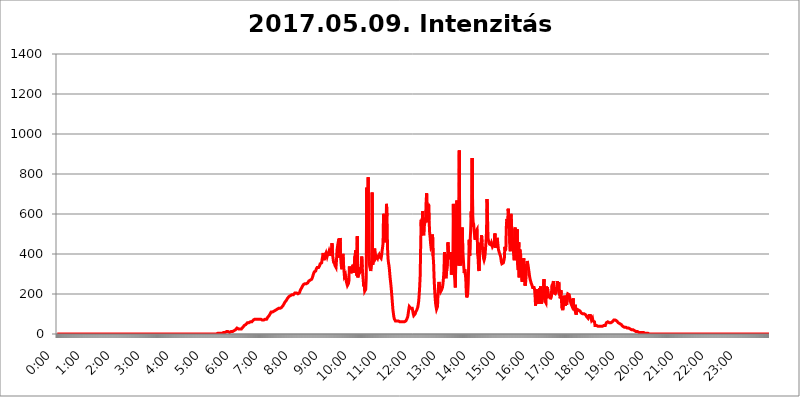
| Category | 2017.05.09. Intenzitás [W/m^2] |
|---|---|
| 0.0 | 0 |
| 0.0006944444444444445 | 0 |
| 0.001388888888888889 | 0 |
| 0.0020833333333333333 | 0 |
| 0.002777777777777778 | 0 |
| 0.003472222222222222 | 0 |
| 0.004166666666666667 | 0 |
| 0.004861111111111111 | 0 |
| 0.005555555555555556 | 0 |
| 0.0062499999999999995 | 0 |
| 0.006944444444444444 | 0 |
| 0.007638888888888889 | 0 |
| 0.008333333333333333 | 0 |
| 0.009027777777777779 | 0 |
| 0.009722222222222222 | 0 |
| 0.010416666666666666 | 0 |
| 0.011111111111111112 | 0 |
| 0.011805555555555555 | 0 |
| 0.012499999999999999 | 0 |
| 0.013194444444444444 | 0 |
| 0.013888888888888888 | 0 |
| 0.014583333333333332 | 0 |
| 0.015277777777777777 | 0 |
| 0.015972222222222224 | 0 |
| 0.016666666666666666 | 0 |
| 0.017361111111111112 | 0 |
| 0.018055555555555557 | 0 |
| 0.01875 | 0 |
| 0.019444444444444445 | 0 |
| 0.02013888888888889 | 0 |
| 0.020833333333333332 | 0 |
| 0.02152777777777778 | 0 |
| 0.022222222222222223 | 0 |
| 0.02291666666666667 | 0 |
| 0.02361111111111111 | 0 |
| 0.024305555555555556 | 0 |
| 0.024999999999999998 | 0 |
| 0.025694444444444447 | 0 |
| 0.02638888888888889 | 0 |
| 0.027083333333333334 | 0 |
| 0.027777777777777776 | 0 |
| 0.02847222222222222 | 0 |
| 0.029166666666666664 | 0 |
| 0.029861111111111113 | 0 |
| 0.030555555555555555 | 0 |
| 0.03125 | 0 |
| 0.03194444444444445 | 0 |
| 0.03263888888888889 | 0 |
| 0.03333333333333333 | 0 |
| 0.034027777777777775 | 0 |
| 0.034722222222222224 | 0 |
| 0.035416666666666666 | 0 |
| 0.036111111111111115 | 0 |
| 0.03680555555555556 | 0 |
| 0.0375 | 0 |
| 0.03819444444444444 | 0 |
| 0.03888888888888889 | 0 |
| 0.03958333333333333 | 0 |
| 0.04027777777777778 | 0 |
| 0.04097222222222222 | 0 |
| 0.041666666666666664 | 0 |
| 0.042361111111111106 | 0 |
| 0.04305555555555556 | 0 |
| 0.043750000000000004 | 0 |
| 0.044444444444444446 | 0 |
| 0.04513888888888889 | 0 |
| 0.04583333333333334 | 0 |
| 0.04652777777777778 | 0 |
| 0.04722222222222222 | 0 |
| 0.04791666666666666 | 0 |
| 0.04861111111111111 | 0 |
| 0.049305555555555554 | 0 |
| 0.049999999999999996 | 0 |
| 0.05069444444444445 | 0 |
| 0.051388888888888894 | 0 |
| 0.052083333333333336 | 0 |
| 0.05277777777777778 | 0 |
| 0.05347222222222222 | 0 |
| 0.05416666666666667 | 0 |
| 0.05486111111111111 | 0 |
| 0.05555555555555555 | 0 |
| 0.05625 | 0 |
| 0.05694444444444444 | 0 |
| 0.057638888888888885 | 0 |
| 0.05833333333333333 | 0 |
| 0.05902777777777778 | 0 |
| 0.059722222222222225 | 0 |
| 0.06041666666666667 | 0 |
| 0.061111111111111116 | 0 |
| 0.06180555555555556 | 0 |
| 0.0625 | 0 |
| 0.06319444444444444 | 0 |
| 0.06388888888888888 | 0 |
| 0.06458333333333334 | 0 |
| 0.06527777777777778 | 0 |
| 0.06597222222222222 | 0 |
| 0.06666666666666667 | 0 |
| 0.06736111111111111 | 0 |
| 0.06805555555555555 | 0 |
| 0.06874999999999999 | 0 |
| 0.06944444444444443 | 0 |
| 0.07013888888888889 | 0 |
| 0.07083333333333333 | 0 |
| 0.07152777777777779 | 0 |
| 0.07222222222222223 | 0 |
| 0.07291666666666667 | 0 |
| 0.07361111111111111 | 0 |
| 0.07430555555555556 | 0 |
| 0.075 | 0 |
| 0.07569444444444444 | 0 |
| 0.0763888888888889 | 0 |
| 0.07708333333333334 | 0 |
| 0.07777777777777778 | 0 |
| 0.07847222222222222 | 0 |
| 0.07916666666666666 | 0 |
| 0.0798611111111111 | 0 |
| 0.08055555555555556 | 0 |
| 0.08125 | 0 |
| 0.08194444444444444 | 0 |
| 0.08263888888888889 | 0 |
| 0.08333333333333333 | 0 |
| 0.08402777777777777 | 0 |
| 0.08472222222222221 | 0 |
| 0.08541666666666665 | 0 |
| 0.08611111111111112 | 0 |
| 0.08680555555555557 | 0 |
| 0.08750000000000001 | 0 |
| 0.08819444444444445 | 0 |
| 0.08888888888888889 | 0 |
| 0.08958333333333333 | 0 |
| 0.09027777777777778 | 0 |
| 0.09097222222222222 | 0 |
| 0.09166666666666667 | 0 |
| 0.09236111111111112 | 0 |
| 0.09305555555555556 | 0 |
| 0.09375 | 0 |
| 0.09444444444444444 | 0 |
| 0.09513888888888888 | 0 |
| 0.09583333333333333 | 0 |
| 0.09652777777777777 | 0 |
| 0.09722222222222222 | 0 |
| 0.09791666666666667 | 0 |
| 0.09861111111111111 | 0 |
| 0.09930555555555555 | 0 |
| 0.09999999999999999 | 0 |
| 0.10069444444444443 | 0 |
| 0.1013888888888889 | 0 |
| 0.10208333333333335 | 0 |
| 0.10277777777777779 | 0 |
| 0.10347222222222223 | 0 |
| 0.10416666666666667 | 0 |
| 0.10486111111111111 | 0 |
| 0.10555555555555556 | 0 |
| 0.10625 | 0 |
| 0.10694444444444444 | 0 |
| 0.1076388888888889 | 0 |
| 0.10833333333333334 | 0 |
| 0.10902777777777778 | 0 |
| 0.10972222222222222 | 0 |
| 0.1111111111111111 | 0 |
| 0.11180555555555556 | 0 |
| 0.11180555555555556 | 0 |
| 0.1125 | 0 |
| 0.11319444444444444 | 0 |
| 0.11388888888888889 | 0 |
| 0.11458333333333333 | 0 |
| 0.11527777777777777 | 0 |
| 0.11597222222222221 | 0 |
| 0.11666666666666665 | 0 |
| 0.1173611111111111 | 0 |
| 0.11805555555555557 | 0 |
| 0.11944444444444445 | 0 |
| 0.12013888888888889 | 0 |
| 0.12083333333333333 | 0 |
| 0.12152777777777778 | 0 |
| 0.12222222222222223 | 0 |
| 0.12291666666666667 | 0 |
| 0.12291666666666667 | 0 |
| 0.12361111111111112 | 0 |
| 0.12430555555555556 | 0 |
| 0.125 | 0 |
| 0.12569444444444444 | 0 |
| 0.12638888888888888 | 0 |
| 0.12708333333333333 | 0 |
| 0.16875 | 0 |
| 0.12847222222222224 | 0 |
| 0.12916666666666668 | 0 |
| 0.12986111111111112 | 0 |
| 0.13055555555555556 | 0 |
| 0.13125 | 0 |
| 0.13194444444444445 | 0 |
| 0.1326388888888889 | 0 |
| 0.13333333333333333 | 0 |
| 0.13402777777777777 | 0 |
| 0.13402777777777777 | 0 |
| 0.13472222222222222 | 0 |
| 0.13541666666666666 | 0 |
| 0.1361111111111111 | 0 |
| 0.13749999999999998 | 0 |
| 0.13819444444444443 | 0 |
| 0.1388888888888889 | 0 |
| 0.13958333333333334 | 0 |
| 0.14027777777777778 | 0 |
| 0.14097222222222222 | 0 |
| 0.14166666666666666 | 0 |
| 0.1423611111111111 | 0 |
| 0.14305555555555557 | 0 |
| 0.14375000000000002 | 0 |
| 0.14444444444444446 | 0 |
| 0.1451388888888889 | 0 |
| 0.1451388888888889 | 0 |
| 0.14652777777777778 | 0 |
| 0.14722222222222223 | 0 |
| 0.14791666666666667 | 0 |
| 0.1486111111111111 | 0 |
| 0.14930555555555555 | 0 |
| 0.15 | 0 |
| 0.15069444444444444 | 0 |
| 0.15138888888888888 | 0 |
| 0.15208333333333332 | 0 |
| 0.15277777777777776 | 0 |
| 0.15347222222222223 | 0 |
| 0.15416666666666667 | 0 |
| 0.15486111111111112 | 0 |
| 0.15555555555555556 | 0 |
| 0.15625 | 0 |
| 0.15694444444444444 | 0 |
| 0.15763888888888888 | 0 |
| 0.15833333333333333 | 0 |
| 0.15902777777777777 | 0 |
| 0.15972222222222224 | 0 |
| 0.16041666666666668 | 0 |
| 0.16111111111111112 | 0 |
| 0.16180555555555556 | 0 |
| 0.1625 | 0 |
| 0.16319444444444445 | 0 |
| 0.1638888888888889 | 0 |
| 0.16458333333333333 | 0 |
| 0.16527777777777777 | 0 |
| 0.16597222222222222 | 0 |
| 0.16666666666666666 | 0 |
| 0.1673611111111111 | 0 |
| 0.16805555555555554 | 0 |
| 0.16874999999999998 | 0 |
| 0.16944444444444443 | 0 |
| 0.17013888888888887 | 0 |
| 0.1708333333333333 | 0 |
| 0.17152777777777775 | 0 |
| 0.17222222222222225 | 0 |
| 0.1729166666666667 | 0 |
| 0.17361111111111113 | 0 |
| 0.17430555555555557 | 0 |
| 0.17500000000000002 | 0 |
| 0.17569444444444446 | 0 |
| 0.1763888888888889 | 0 |
| 0.17708333333333334 | 0 |
| 0.17777777777777778 | 0 |
| 0.17847222222222223 | 0 |
| 0.17916666666666667 | 0 |
| 0.1798611111111111 | 0 |
| 0.18055555555555555 | 0 |
| 0.18125 | 0 |
| 0.18194444444444444 | 0 |
| 0.1826388888888889 | 0 |
| 0.18333333333333335 | 0 |
| 0.1840277777777778 | 0 |
| 0.18472222222222223 | 0 |
| 0.18541666666666667 | 0 |
| 0.18611111111111112 | 0 |
| 0.18680555555555556 | 0 |
| 0.1875 | 0 |
| 0.18819444444444444 | 0 |
| 0.18888888888888888 | 0 |
| 0.18958333333333333 | 0 |
| 0.19027777777777777 | 0 |
| 0.1909722222222222 | 0 |
| 0.19166666666666665 | 0 |
| 0.19236111111111112 | 0 |
| 0.19305555555555554 | 0 |
| 0.19375 | 0 |
| 0.19444444444444445 | 0 |
| 0.1951388888888889 | 0 |
| 0.19583333333333333 | 0 |
| 0.19652777777777777 | 0 |
| 0.19722222222222222 | 0 |
| 0.19791666666666666 | 0 |
| 0.1986111111111111 | 0 |
| 0.19930555555555554 | 0 |
| 0.19999999999999998 | 0 |
| 0.20069444444444443 | 0 |
| 0.20138888888888887 | 0 |
| 0.2020833333333333 | 0 |
| 0.2027777777777778 | 0 |
| 0.2034722222222222 | 0 |
| 0.2041666666666667 | 0 |
| 0.20486111111111113 | 0 |
| 0.20555555555555557 | 0 |
| 0.20625000000000002 | 0 |
| 0.20694444444444446 | 0 |
| 0.2076388888888889 | 0 |
| 0.20833333333333334 | 0 |
| 0.20902777777777778 | 0 |
| 0.20972222222222223 | 0 |
| 0.21041666666666667 | 0 |
| 0.2111111111111111 | 0 |
| 0.21180555555555555 | 0 |
| 0.2125 | 0 |
| 0.21319444444444444 | 0 |
| 0.2138888888888889 | 0 |
| 0.21458333333333335 | 0 |
| 0.2152777777777778 | 0 |
| 0.21597222222222223 | 0 |
| 0.21666666666666667 | 0 |
| 0.21736111111111112 | 0 |
| 0.21805555555555556 | 0 |
| 0.21875 | 0 |
| 0.21944444444444444 | 0 |
| 0.22013888888888888 | 0 |
| 0.22083333333333333 | 0 |
| 0.22152777777777777 | 0 |
| 0.2222222222222222 | 0 |
| 0.22291666666666665 | 0 |
| 0.2236111111111111 | 0 |
| 0.22430555555555556 | 0 |
| 0.225 | 3.525 |
| 0.22569444444444445 | 3.525 |
| 0.2263888888888889 | 3.525 |
| 0.22708333333333333 | 3.525 |
| 0.22777777777777777 | 3.525 |
| 0.22847222222222222 | 3.525 |
| 0.22916666666666666 | 3.525 |
| 0.2298611111111111 | 3.525 |
| 0.23055555555555554 | 3.525 |
| 0.23124999999999998 | 3.525 |
| 0.23194444444444443 | 3.525 |
| 0.23263888888888887 | 3.525 |
| 0.2333333333333333 | 7.887 |
| 0.2340277777777778 | 7.887 |
| 0.2347222222222222 | 7.887 |
| 0.2354166666666667 | 7.887 |
| 0.23611111111111113 | 12.257 |
| 0.23680555555555557 | 12.257 |
| 0.23750000000000002 | 12.257 |
| 0.23819444444444446 | 12.257 |
| 0.2388888888888889 | 12.257 |
| 0.23958333333333334 | 12.257 |
| 0.24027777777777778 | 12.257 |
| 0.24097222222222223 | 7.887 |
| 0.24166666666666667 | 7.887 |
| 0.2423611111111111 | 7.887 |
| 0.24305555555555555 | 12.257 |
| 0.24375 | 12.257 |
| 0.24444444444444446 | 12.257 |
| 0.24513888888888888 | 12.257 |
| 0.24583333333333335 | 12.257 |
| 0.2465277777777778 | 12.257 |
| 0.24722222222222223 | 16.636 |
| 0.24791666666666667 | 16.636 |
| 0.24861111111111112 | 21.024 |
| 0.24930555555555556 | 21.024 |
| 0.25 | 21.024 |
| 0.25069444444444444 | 25.419 |
| 0.2513888888888889 | 25.419 |
| 0.2520833333333333 | 29.823 |
| 0.25277777777777777 | 29.823 |
| 0.2534722222222222 | 29.823 |
| 0.25416666666666665 | 25.419 |
| 0.2548611111111111 | 25.419 |
| 0.2555555555555556 | 25.419 |
| 0.25625000000000003 | 25.419 |
| 0.2569444444444445 | 21.024 |
| 0.2576388888888889 | 25.419 |
| 0.25833333333333336 | 25.419 |
| 0.2590277777777778 | 29.823 |
| 0.25972222222222224 | 29.823 |
| 0.2604166666666667 | 34.234 |
| 0.2611111111111111 | 38.653 |
| 0.26180555555555557 | 38.653 |
| 0.2625 | 43.079 |
| 0.26319444444444445 | 43.079 |
| 0.2638888888888889 | 47.511 |
| 0.26458333333333334 | 47.511 |
| 0.2652777777777778 | 51.951 |
| 0.2659722222222222 | 51.951 |
| 0.26666666666666666 | 56.398 |
| 0.2673611111111111 | 56.398 |
| 0.26805555555555555 | 56.398 |
| 0.26875 | 56.398 |
| 0.26944444444444443 | 60.85 |
| 0.2701388888888889 | 56.398 |
| 0.2708333333333333 | 60.85 |
| 0.27152777777777776 | 60.85 |
| 0.2722222222222222 | 60.85 |
| 0.27291666666666664 | 60.85 |
| 0.2736111111111111 | 65.31 |
| 0.2743055555555555 | 65.31 |
| 0.27499999999999997 | 69.775 |
| 0.27569444444444446 | 69.775 |
| 0.27638888888888885 | 69.775 |
| 0.27708333333333335 | 74.246 |
| 0.2777777777777778 | 74.246 |
| 0.27847222222222223 | 74.246 |
| 0.2791666666666667 | 74.246 |
| 0.2798611111111111 | 74.246 |
| 0.28055555555555556 | 74.246 |
| 0.28125 | 74.246 |
| 0.28194444444444444 | 74.246 |
| 0.2826388888888889 | 74.246 |
| 0.2833333333333333 | 74.246 |
| 0.28402777777777777 | 74.246 |
| 0.2847222222222222 | 74.246 |
| 0.28541666666666665 | 74.246 |
| 0.28611111111111115 | 69.775 |
| 0.28680555555555554 | 69.775 |
| 0.28750000000000003 | 69.775 |
| 0.2881944444444445 | 69.775 |
| 0.2888888888888889 | 69.775 |
| 0.28958333333333336 | 69.775 |
| 0.2902777777777778 | 69.775 |
| 0.29097222222222224 | 69.775 |
| 0.2916666666666667 | 74.246 |
| 0.2923611111111111 | 74.246 |
| 0.29305555555555557 | 74.246 |
| 0.29375 | 74.246 |
| 0.29444444444444445 | 78.722 |
| 0.2951388888888889 | 83.205 |
| 0.29583333333333334 | 83.205 |
| 0.2965277777777778 | 87.692 |
| 0.2972222222222222 | 92.184 |
| 0.29791666666666666 | 96.682 |
| 0.2986111111111111 | 101.184 |
| 0.29930555555555555 | 105.69 |
| 0.3 | 110.201 |
| 0.30069444444444443 | 110.201 |
| 0.3013888888888889 | 110.201 |
| 0.3020833333333333 | 110.201 |
| 0.30277777777777776 | 110.201 |
| 0.3034722222222222 | 110.201 |
| 0.30416666666666664 | 114.716 |
| 0.3048611111111111 | 114.716 |
| 0.3055555555555555 | 119.235 |
| 0.30624999999999997 | 119.235 |
| 0.3069444444444444 | 119.235 |
| 0.3076388888888889 | 123.758 |
| 0.30833333333333335 | 123.758 |
| 0.3090277777777778 | 128.284 |
| 0.30972222222222223 | 128.284 |
| 0.3104166666666667 | 128.284 |
| 0.3111111111111111 | 128.284 |
| 0.31180555555555556 | 128.284 |
| 0.3125 | 128.284 |
| 0.31319444444444444 | 128.284 |
| 0.3138888888888889 | 128.284 |
| 0.3145833333333333 | 132.814 |
| 0.31527777777777777 | 137.347 |
| 0.3159722222222222 | 137.347 |
| 0.31666666666666665 | 141.884 |
| 0.31736111111111115 | 146.423 |
| 0.31805555555555554 | 150.964 |
| 0.31875000000000003 | 155.509 |
| 0.3194444444444445 | 160.056 |
| 0.3201388888888889 | 164.605 |
| 0.32083333333333336 | 164.605 |
| 0.3215277777777778 | 169.156 |
| 0.32222222222222224 | 173.709 |
| 0.3229166666666667 | 178.264 |
| 0.3236111111111111 | 182.82 |
| 0.32430555555555557 | 182.82 |
| 0.325 | 187.378 |
| 0.32569444444444445 | 187.378 |
| 0.3263888888888889 | 191.937 |
| 0.32708333333333334 | 191.937 |
| 0.3277777777777778 | 191.937 |
| 0.3284722222222222 | 196.497 |
| 0.32916666666666666 | 196.497 |
| 0.3298611111111111 | 196.497 |
| 0.33055555555555555 | 196.497 |
| 0.33125 | 196.497 |
| 0.33194444444444443 | 201.058 |
| 0.3326388888888889 | 201.058 |
| 0.3333333333333333 | 205.62 |
| 0.3340277777777778 | 205.62 |
| 0.3347222222222222 | 205.62 |
| 0.3354166666666667 | 205.62 |
| 0.3361111111111111 | 205.62 |
| 0.3368055555555556 | 201.058 |
| 0.33749999999999997 | 201.058 |
| 0.33819444444444446 | 201.058 |
| 0.33888888888888885 | 205.62 |
| 0.33958333333333335 | 205.62 |
| 0.34027777777777773 | 210.182 |
| 0.34097222222222223 | 219.309 |
| 0.3416666666666666 | 223.873 |
| 0.3423611111111111 | 228.436 |
| 0.3430555555555555 | 233 |
| 0.34375 | 237.564 |
| 0.3444444444444445 | 242.127 |
| 0.3451388888888889 | 246.689 |
| 0.3458333333333334 | 251.251 |
| 0.34652777777777777 | 251.251 |
| 0.34722222222222227 | 251.251 |
| 0.34791666666666665 | 251.251 |
| 0.34861111111111115 | 251.251 |
| 0.34930555555555554 | 251.251 |
| 0.35000000000000003 | 251.251 |
| 0.3506944444444444 | 255.813 |
| 0.3513888888888889 | 255.813 |
| 0.3520833333333333 | 260.373 |
| 0.3527777777777778 | 264.932 |
| 0.3534722222222222 | 264.932 |
| 0.3541666666666667 | 269.49 |
| 0.3548611111111111 | 269.49 |
| 0.35555555555555557 | 269.49 |
| 0.35625 | 269.49 |
| 0.35694444444444445 | 274.047 |
| 0.3576388888888889 | 278.603 |
| 0.35833333333333334 | 287.709 |
| 0.3590277777777778 | 296.808 |
| 0.3597222222222222 | 301.354 |
| 0.36041666666666666 | 310.44 |
| 0.3611111111111111 | 310.44 |
| 0.36180555555555555 | 314.98 |
| 0.3625 | 314.98 |
| 0.36319444444444443 | 324.052 |
| 0.3638888888888889 | 324.052 |
| 0.3645833333333333 | 333.113 |
| 0.3652777777777778 | 333.113 |
| 0.3659722222222222 | 337.639 |
| 0.3666666666666667 | 333.113 |
| 0.3673611111111111 | 337.639 |
| 0.3680555555555556 | 342.162 |
| 0.36874999999999997 | 351.198 |
| 0.36944444444444446 | 351.198 |
| 0.37013888888888885 | 355.712 |
| 0.37083333333333335 | 355.712 |
| 0.37152777777777773 | 373.729 |
| 0.37222222222222223 | 387.202 |
| 0.3729166666666666 | 405.108 |
| 0.3736111111111111 | 405.108 |
| 0.3743055555555555 | 369.23 |
| 0.375 | 400.638 |
| 0.3756944444444445 | 391.685 |
| 0.3763888888888889 | 396.164 |
| 0.3770833333333334 | 405.108 |
| 0.37777777777777777 | 396.164 |
| 0.37847222222222227 | 387.202 |
| 0.37916666666666665 | 396.164 |
| 0.37986111111111115 | 391.685 |
| 0.38055555555555554 | 405.108 |
| 0.38125000000000003 | 414.035 |
| 0.3819444444444444 | 405.108 |
| 0.3826388888888889 | 391.685 |
| 0.3833333333333333 | 414.035 |
| 0.3840277777777778 | 418.492 |
| 0.3847222222222222 | 427.39 |
| 0.3854166666666667 | 453.968 |
| 0.3861111111111111 | 396.164 |
| 0.38680555555555557 | 378.224 |
| 0.3875 | 360.221 |
| 0.38819444444444445 | 360.221 |
| 0.3888888888888889 | 351.198 |
| 0.38958333333333334 | 342.162 |
| 0.3902777777777778 | 337.639 |
| 0.3909722222222222 | 333.113 |
| 0.39166666666666666 | 369.23 |
| 0.3923611111111111 | 418.492 |
| 0.39305555555555555 | 418.492 |
| 0.39375 | 453.968 |
| 0.39444444444444443 | 458.38 |
| 0.3951388888888889 | 475.972 |
| 0.3958333333333333 | 382.715 |
| 0.3965277777777778 | 480.356 |
| 0.3972222222222222 | 414.035 |
| 0.3979166666666667 | 360.221 |
| 0.3986111111111111 | 333.113 |
| 0.3993055555555556 | 324.052 |
| 0.39999999999999997 | 382.715 |
| 0.40069444444444446 | 400.638 |
| 0.40138888888888885 | 355.712 |
| 0.40208333333333335 | 355.712 |
| 0.40277777777777773 | 287.709 |
| 0.40347222222222223 | 283.156 |
| 0.4041666666666666 | 296.808 |
| 0.4048611111111111 | 278.603 |
| 0.4055555555555555 | 260.373 |
| 0.40625 | 251.251 |
| 0.4069444444444445 | 242.127 |
| 0.4076388888888889 | 242.127 |
| 0.4083333333333334 | 251.251 |
| 0.40902777777777777 | 264.932 |
| 0.40972222222222227 | 337.639 |
| 0.41041666666666665 | 314.98 |
| 0.41111111111111115 | 319.517 |
| 0.41180555555555554 | 310.44 |
| 0.41250000000000003 | 310.44 |
| 0.4131944444444444 | 305.898 |
| 0.4138888888888889 | 328.584 |
| 0.4145833333333333 | 346.682 |
| 0.4152777777777778 | 337.639 |
| 0.4159722222222222 | 305.898 |
| 0.4166666666666667 | 310.44 |
| 0.4173611111111111 | 387.202 |
| 0.41805555555555557 | 382.715 |
| 0.41875 | 418.492 |
| 0.41944444444444445 | 319.517 |
| 0.4201388888888889 | 292.259 |
| 0.42083333333333334 | 489.108 |
| 0.4215277777777778 | 283.156 |
| 0.4222222222222222 | 278.603 |
| 0.42291666666666666 | 305.898 |
| 0.4236111111111111 | 333.113 |
| 0.42430555555555555 | 333.113 |
| 0.425 | 319.517 |
| 0.42569444444444443 | 328.584 |
| 0.4263888888888889 | 337.639 |
| 0.4270833333333333 | 387.202 |
| 0.4277777777777778 | 333.113 |
| 0.4284722222222222 | 296.808 |
| 0.4291666666666667 | 269.49 |
| 0.4298611111111111 | 237.564 |
| 0.4305555555555556 | 251.251 |
| 0.43124999999999997 | 214.746 |
| 0.43194444444444446 | 210.182 |
| 0.43263888888888885 | 223.873 |
| 0.43333333333333335 | 278.603 |
| 0.43402777777777773 | 731.896 |
| 0.43472222222222223 | 414.035 |
| 0.4354166666666666 | 629.948 |
| 0.4361111111111111 | 783.342 |
| 0.4368055555555555 | 391.685 |
| 0.4375 | 360.221 |
| 0.4381944444444445 | 337.639 |
| 0.4388888888888889 | 328.584 |
| 0.4395833333333334 | 314.98 |
| 0.44027777777777777 | 319.517 |
| 0.44097222222222227 | 364.728 |
| 0.44166666666666665 | 707.8 |
| 0.44236111111111115 | 346.682 |
| 0.44305555555555554 | 351.198 |
| 0.44375000000000003 | 373.729 |
| 0.4444444444444444 | 373.729 |
| 0.4451388888888889 | 427.39 |
| 0.4458333333333333 | 396.164 |
| 0.4465277777777778 | 378.224 |
| 0.4472222222222222 | 373.729 |
| 0.4479166666666667 | 387.202 |
| 0.4486111111111111 | 382.715 |
| 0.44930555555555557 | 378.224 |
| 0.45 | 387.202 |
| 0.45069444444444445 | 387.202 |
| 0.4513888888888889 | 396.164 |
| 0.45208333333333334 | 387.202 |
| 0.4527777777777778 | 387.202 |
| 0.4534722222222222 | 382.715 |
| 0.45416666666666666 | 378.224 |
| 0.4548611111111111 | 391.685 |
| 0.45555555555555555 | 414.035 |
| 0.45625 | 431.833 |
| 0.45694444444444443 | 453.968 |
| 0.4576388888888889 | 600.661 |
| 0.4583333333333333 | 484.735 |
| 0.4590277777777778 | 480.356 |
| 0.4597222222222222 | 458.38 |
| 0.4604166666666667 | 462.786 |
| 0.4611111111111111 | 532.513 |
| 0.4618055555555556 | 650.667 |
| 0.46249999999999997 | 588.009 |
| 0.46319444444444446 | 431.833 |
| 0.46388888888888885 | 378.224 |
| 0.46458333333333335 | 355.712 |
| 0.46527777777777773 | 342.162 |
| 0.46597222222222223 | 319.517 |
| 0.4666666666666666 | 287.709 |
| 0.4673611111111111 | 264.932 |
| 0.4680555555555555 | 242.127 |
| 0.46875 | 214.746 |
| 0.4694444444444445 | 182.82 |
| 0.4701388888888889 | 150.964 |
| 0.4708333333333334 | 119.235 |
| 0.47152777777777777 | 101.184 |
| 0.47222222222222227 | 83.205 |
| 0.47291666666666665 | 74.246 |
| 0.47361111111111115 | 69.775 |
| 0.47430555555555554 | 65.31 |
| 0.47500000000000003 | 60.85 |
| 0.4756944444444444 | 65.31 |
| 0.4763888888888889 | 65.31 |
| 0.4770833333333333 | 65.31 |
| 0.4777777777777778 | 65.31 |
| 0.4784722222222222 | 65.31 |
| 0.4791666666666667 | 65.31 |
| 0.4798611111111111 | 60.85 |
| 0.48055555555555557 | 60.85 |
| 0.48125 | 56.398 |
| 0.48194444444444445 | 60.85 |
| 0.4826388888888889 | 60.85 |
| 0.48333333333333334 | 60.85 |
| 0.4840277777777778 | 60.85 |
| 0.4847222222222222 | 60.85 |
| 0.48541666666666666 | 60.85 |
| 0.4861111111111111 | 60.85 |
| 0.48680555555555555 | 60.85 |
| 0.4875 | 65.31 |
| 0.48819444444444443 | 65.31 |
| 0.4888888888888889 | 65.31 |
| 0.4895833333333333 | 69.775 |
| 0.4902777777777778 | 74.246 |
| 0.4909722222222222 | 78.722 |
| 0.4916666666666667 | 87.692 |
| 0.4923611111111111 | 105.69 |
| 0.4930555555555556 | 123.758 |
| 0.49374999999999997 | 137.347 |
| 0.49444444444444446 | 141.884 |
| 0.49513888888888885 | 137.347 |
| 0.49583333333333335 | 128.284 |
| 0.49652777777777773 | 128.284 |
| 0.49722222222222223 | 128.284 |
| 0.4979166666666666 | 128.284 |
| 0.4986111111111111 | 114.716 |
| 0.4993055555555555 | 101.184 |
| 0.5 | 92.184 |
| 0.5006944444444444 | 92.184 |
| 0.5013888888888889 | 96.682 |
| 0.5020833333333333 | 101.184 |
| 0.5027777777777778 | 110.201 |
| 0.5034722222222222 | 114.716 |
| 0.5041666666666667 | 119.235 |
| 0.5048611111111111 | 123.758 |
| 0.5055555555555555 | 132.814 |
| 0.50625 | 146.423 |
| 0.5069444444444444 | 164.605 |
| 0.5076388888888889 | 196.497 |
| 0.5083333333333333 | 237.564 |
| 0.5090277777777777 | 292.259 |
| 0.5097222222222222 | 440.702 |
| 0.5104166666666666 | 571.049 |
| 0.5111111111111112 | 493.475 |
| 0.5118055555555555 | 493.475 |
| 0.5125000000000001 | 613.252 |
| 0.5131944444444444 | 519.555 |
| 0.513888888888889 | 493.475 |
| 0.5145833333333333 | 532.513 |
| 0.5152777777777778 | 549.704 |
| 0.5159722222222222 | 562.53 |
| 0.5166666666666667 | 583.779 |
| 0.517361111111111 | 658.909 |
| 0.5180555555555556 | 703.762 |
| 0.5187499999999999 | 617.436 |
| 0.5194444444444445 | 558.261 |
| 0.5201388888888888 | 588.009 |
| 0.5208333333333334 | 650.667 |
| 0.5215277777777778 | 571.049 |
| 0.5222222222222223 | 510.885 |
| 0.5229166666666667 | 484.735 |
| 0.5236111111111111 | 453.968 |
| 0.5243055555555556 | 431.833 |
| 0.525 | 427.39 |
| 0.5256944444444445 | 440.702 |
| 0.5263888888888889 | 497.836 |
| 0.5270833333333333 | 391.685 |
| 0.5277777777777778 | 360.221 |
| 0.5284722222222222 | 287.709 |
| 0.5291666666666667 | 228.436 |
| 0.5298611111111111 | 187.378 |
| 0.5305555555555556 | 155.509 |
| 0.53125 | 137.347 |
| 0.5319444444444444 | 123.758 |
| 0.5326388888888889 | 119.235 |
| 0.5333333333333333 | 137.347 |
| 0.5340277777777778 | 196.497 |
| 0.5347222222222222 | 242.127 |
| 0.5354166666666667 | 260.373 |
| 0.5361111111111111 | 237.564 |
| 0.5368055555555555 | 219.309 |
| 0.5375 | 210.182 |
| 0.5381944444444444 | 214.746 |
| 0.5388888888888889 | 219.309 |
| 0.5395833333333333 | 223.873 |
| 0.5402777777777777 | 233 |
| 0.5409722222222222 | 251.251 |
| 0.5416666666666666 | 278.603 |
| 0.5423611111111112 | 314.98 |
| 0.5430555555555555 | 409.574 |
| 0.5437500000000001 | 301.354 |
| 0.5444444444444444 | 287.709 |
| 0.545138888888889 | 278.603 |
| 0.5458333333333333 | 274.047 |
| 0.5465277777777778 | 278.603 |
| 0.5472222222222222 | 355.712 |
| 0.5479166666666667 | 458.38 |
| 0.548611111111111 | 418.492 |
| 0.5493055555555556 | 378.224 |
| 0.5499999999999999 | 391.685 |
| 0.5506944444444445 | 373.729 |
| 0.5513888888888888 | 409.574 |
| 0.5520833333333334 | 378.224 |
| 0.5527777777777778 | 296.808 |
| 0.5534722222222223 | 378.224 |
| 0.5541666666666667 | 319.517 |
| 0.5548611111111111 | 337.639 |
| 0.5555555555555556 | 650.667 |
| 0.55625 | 351.198 |
| 0.5569444444444445 | 296.808 |
| 0.5576388888888889 | 269.49 |
| 0.5583333333333333 | 233 |
| 0.5590277777777778 | 237.564 |
| 0.5597222222222222 | 579.542 |
| 0.5604166666666667 | 667.123 |
| 0.5611111111111111 | 515.223 |
| 0.5618055555555556 | 414.035 |
| 0.5625 | 369.23 |
| 0.5631944444444444 | 342.162 |
| 0.5638888888888889 | 917.534 |
| 0.5645833333333333 | 405.108 |
| 0.5652777777777778 | 342.162 |
| 0.5659722222222222 | 369.23 |
| 0.5666666666666667 | 391.685 |
| 0.5673611111111111 | 440.702 |
| 0.5680555555555555 | 532.513 |
| 0.56875 | 422.943 |
| 0.5694444444444444 | 418.492 |
| 0.5701388888888889 | 337.639 |
| 0.5708333333333333 | 305.898 |
| 0.5715277777777777 | 324.052 |
| 0.5722222222222222 | 324.052 |
| 0.5729166666666666 | 283.156 |
| 0.5736111111111112 | 214.746 |
| 0.5743055555555555 | 182.82 |
| 0.5750000000000001 | 182.82 |
| 0.5756944444444444 | 201.058 |
| 0.576388888888889 | 251.251 |
| 0.5770833333333333 | 355.712 |
| 0.5777777777777778 | 471.582 |
| 0.5784722222222222 | 391.685 |
| 0.5791666666666667 | 471.582 |
| 0.579861111111111 | 523.88 |
| 0.5805555555555556 | 613.252 |
| 0.5812499999999999 | 536.82 |
| 0.5819444444444445 | 879.719 |
| 0.5826388888888888 | 600.661 |
| 0.5833333333333334 | 558.261 |
| 0.5840277777777778 | 549.704 |
| 0.5847222222222223 | 515.223 |
| 0.5854166666666667 | 489.108 |
| 0.5861111111111111 | 471.582 |
| 0.5868055555555556 | 510.885 |
| 0.5875 | 506.542 |
| 0.5881944444444445 | 510.885 |
| 0.5888888888888889 | 523.88 |
| 0.5895833333333333 | 400.638 |
| 0.5902777777777778 | 378.224 |
| 0.5909722222222222 | 324.052 |
| 0.5916666666666667 | 314.98 |
| 0.5923611111111111 | 400.638 |
| 0.5930555555555556 | 453.968 |
| 0.59375 | 431.833 |
| 0.5944444444444444 | 458.38 |
| 0.5951388888888889 | 493.475 |
| 0.5958333333333333 | 458.38 |
| 0.5965277777777778 | 422.943 |
| 0.5972222222222222 | 400.638 |
| 0.5979166666666667 | 378.224 |
| 0.5986111111111111 | 369.23 |
| 0.5993055555555555 | 378.224 |
| 0.6 | 396.164 |
| 0.6006944444444444 | 396.164 |
| 0.6013888888888889 | 462.786 |
| 0.6020833333333333 | 515.223 |
| 0.6027777777777777 | 675.311 |
| 0.6034722222222222 | 583.779 |
| 0.6041666666666666 | 480.356 |
| 0.6048611111111112 | 467.187 |
| 0.6055555555555555 | 462.786 |
| 0.6062500000000001 | 449.551 |
| 0.6069444444444444 | 449.551 |
| 0.607638888888889 | 449.551 |
| 0.6083333333333333 | 445.129 |
| 0.6090277777777778 | 453.968 |
| 0.6097222222222222 | 445.129 |
| 0.6104166666666667 | 436.27 |
| 0.611111111111111 | 431.833 |
| 0.6118055555555556 | 445.129 |
| 0.6124999999999999 | 436.27 |
| 0.6131944444444445 | 440.702 |
| 0.6138888888888888 | 502.192 |
| 0.6145833333333334 | 431.833 |
| 0.6152777777777778 | 462.786 |
| 0.6159722222222223 | 445.129 |
| 0.6166666666666667 | 480.356 |
| 0.6173611111111111 | 471.582 |
| 0.6180555555555556 | 467.187 |
| 0.61875 | 422.943 |
| 0.6194444444444445 | 418.492 |
| 0.6201388888888889 | 405.108 |
| 0.6208333333333333 | 400.638 |
| 0.6215277777777778 | 391.685 |
| 0.6222222222222222 | 378.224 |
| 0.6229166666666667 | 360.221 |
| 0.6236111111111111 | 351.198 |
| 0.6243055555555556 | 351.198 |
| 0.625 | 351.198 |
| 0.6256944444444444 | 355.712 |
| 0.6263888888888889 | 360.221 |
| 0.6270833333333333 | 378.224 |
| 0.6277777777777778 | 436.27 |
| 0.6284722222222222 | 418.492 |
| 0.6291666666666667 | 427.39 |
| 0.6298611111111111 | 536.82 |
| 0.6305555555555555 | 575.299 |
| 0.63125 | 562.53 |
| 0.6319444444444444 | 528.2 |
| 0.6326388888888889 | 625.784 |
| 0.6333333333333333 | 536.82 |
| 0.6340277777777777 | 553.986 |
| 0.6347222222222222 | 453.968 |
| 0.6354166666666666 | 414.035 |
| 0.6361111111111112 | 600.661 |
| 0.6368055555555555 | 588.009 |
| 0.6375000000000001 | 515.223 |
| 0.6381944444444444 | 427.39 |
| 0.638888888888889 | 480.356 |
| 0.6395833333333333 | 418.492 |
| 0.6402777777777778 | 396.164 |
| 0.6409722222222222 | 369.23 |
| 0.6416666666666667 | 523.88 |
| 0.642361111111111 | 532.513 |
| 0.6430555555555556 | 387.202 |
| 0.6437499999999999 | 369.23 |
| 0.6444444444444445 | 440.702 |
| 0.6451388888888888 | 523.88 |
| 0.6458333333333334 | 346.682 |
| 0.6465277777777778 | 319.517 |
| 0.6472222222222223 | 458.38 |
| 0.6479166666666667 | 283.156 |
| 0.6486111111111111 | 422.943 |
| 0.6493055555555556 | 409.574 |
| 0.65 | 396.164 |
| 0.6506944444444445 | 396.164 |
| 0.6513888888888889 | 278.603 |
| 0.6520833333333333 | 260.373 |
| 0.6527777777777778 | 305.898 |
| 0.6534722222222222 | 287.709 |
| 0.6541666666666667 | 378.224 |
| 0.6548611111111111 | 260.373 |
| 0.6555555555555556 | 278.603 |
| 0.65625 | 242.127 |
| 0.6569444444444444 | 260.373 |
| 0.6576388888888889 | 292.259 |
| 0.6583333333333333 | 351.198 |
| 0.6590277777777778 | 364.728 |
| 0.6597222222222222 | 355.712 |
| 0.6604166666666667 | 342.162 |
| 0.6611111111111111 | 324.052 |
| 0.6618055555555555 | 305.898 |
| 0.6625 | 287.709 |
| 0.6631944444444444 | 274.047 |
| 0.6638888888888889 | 264.932 |
| 0.6645833333333333 | 255.813 |
| 0.6652777777777777 | 251.251 |
| 0.6659722222222222 | 242.127 |
| 0.6666666666666666 | 233 |
| 0.6673611111111111 | 237.564 |
| 0.6680555555555556 | 237.564 |
| 0.6687500000000001 | 233 |
| 0.6694444444444444 | 223.873 |
| 0.6701388888888888 | 191.937 |
| 0.6708333333333334 | 141.884 |
| 0.6715277777777778 | 137.347 |
| 0.6722222222222222 | 214.746 |
| 0.6729166666666666 | 182.82 |
| 0.6736111111111112 | 223.873 |
| 0.6743055555555556 | 169.156 |
| 0.6749999999999999 | 150.964 |
| 0.6756944444444444 | 214.746 |
| 0.6763888888888889 | 228.436 |
| 0.6770833333333334 | 160.056 |
| 0.6777777777777777 | 237.564 |
| 0.6784722222222223 | 201.058 |
| 0.6791666666666667 | 150.964 |
| 0.6798611111111111 | 164.605 |
| 0.6805555555555555 | 182.82 |
| 0.68125 | 219.309 |
| 0.6819444444444445 | 191.937 |
| 0.6826388888888889 | 274.047 |
| 0.6833333333333332 | 178.264 |
| 0.6840277777777778 | 164.605 |
| 0.6847222222222222 | 160.056 |
| 0.6854166666666667 | 155.509 |
| 0.686111111111111 | 237.564 |
| 0.6868055555555556 | 219.309 |
| 0.6875 | 233 |
| 0.6881944444444444 | 228.436 |
| 0.688888888888889 | 187.378 |
| 0.6895833333333333 | 182.82 |
| 0.6902777777777778 | 182.82 |
| 0.6909722222222222 | 191.937 |
| 0.6916666666666668 | 173.709 |
| 0.6923611111111111 | 173.709 |
| 0.6930555555555555 | 191.937 |
| 0.69375 | 242.127 |
| 0.6944444444444445 | 242.127 |
| 0.6951388888888889 | 251.251 |
| 0.6958333333333333 | 264.932 |
| 0.6965277777777777 | 205.62 |
| 0.6972222222222223 | 201.058 |
| 0.6979166666666666 | 201.058 |
| 0.6986111111111111 | 201.058 |
| 0.6993055555555556 | 201.058 |
| 0.7000000000000001 | 210.182 |
| 0.7006944444444444 | 242.127 |
| 0.7013888888888888 | 264.932 |
| 0.7020833333333334 | 223.873 |
| 0.7027777777777778 | 246.689 |
| 0.7034722222222222 | 260.373 |
| 0.7041666666666666 | 201.058 |
| 0.7048611111111112 | 191.937 |
| 0.7055555555555556 | 178.264 |
| 0.7062499999999999 | 219.309 |
| 0.7069444444444444 | 201.058 |
| 0.7076388888888889 | 132.814 |
| 0.7083333333333334 | 128.284 |
| 0.7090277777777777 | 119.235 |
| 0.7097222222222223 | 119.235 |
| 0.7104166666666667 | 169.156 |
| 0.7111111111111111 | 173.709 |
| 0.7118055555555555 | 191.937 |
| 0.7125 | 141.884 |
| 0.7131944444444445 | 141.884 |
| 0.7138888888888889 | 155.509 |
| 0.7145833333333332 | 146.423 |
| 0.7152777777777778 | 191.937 |
| 0.7159722222222222 | 201.058 |
| 0.7166666666666667 | 201.058 |
| 0.717361111111111 | 201.058 |
| 0.7180555555555556 | 196.497 |
| 0.71875 | 191.937 |
| 0.7194444444444444 | 191.937 |
| 0.720138888888889 | 155.509 |
| 0.7208333333333333 | 150.964 |
| 0.7215277777777778 | 160.056 |
| 0.7222222222222222 | 137.347 |
| 0.7229166666666668 | 146.423 |
| 0.7236111111111111 | 178.264 |
| 0.7243055555555555 | 128.284 |
| 0.725 | 123.758 |
| 0.7256944444444445 | 119.235 |
| 0.7263888888888889 | 146.423 |
| 0.7270833333333333 | 105.69 |
| 0.7277777777777777 | 96.682 |
| 0.7284722222222223 | 101.184 |
| 0.7291666666666666 | 123.758 |
| 0.7298611111111111 | 119.235 |
| 0.7305555555555556 | 119.235 |
| 0.7312500000000001 | 119.235 |
| 0.7319444444444444 | 119.235 |
| 0.7326388888888888 | 114.716 |
| 0.7333333333333334 | 114.716 |
| 0.7340277777777778 | 110.201 |
| 0.7347222222222222 | 105.69 |
| 0.7354166666666666 | 105.69 |
| 0.7361111111111112 | 105.69 |
| 0.7368055555555556 | 101.184 |
| 0.7374999999999999 | 101.184 |
| 0.7381944444444444 | 101.184 |
| 0.7388888888888889 | 101.184 |
| 0.7395833333333334 | 101.184 |
| 0.7402777777777777 | 96.682 |
| 0.7409722222222223 | 96.682 |
| 0.7416666666666667 | 92.184 |
| 0.7423611111111111 | 87.692 |
| 0.7430555555555555 | 87.692 |
| 0.74375 | 87.692 |
| 0.7444444444444445 | 78.722 |
| 0.7451388888888889 | 83.205 |
| 0.7458333333333332 | 92.184 |
| 0.7465277777777778 | 87.692 |
| 0.7472222222222222 | 92.184 |
| 0.7479166666666667 | 92.184 |
| 0.748611111111111 | 87.692 |
| 0.7493055555555556 | 69.775 |
| 0.75 | 65.31 |
| 0.7506944444444444 | 78.722 |
| 0.751388888888889 | 65.31 |
| 0.7520833333333333 | 69.775 |
| 0.7527777777777778 | 69.775 |
| 0.7534722222222222 | 60.85 |
| 0.7541666666666668 | 43.079 |
| 0.7548611111111111 | 38.653 |
| 0.7555555555555555 | 43.079 |
| 0.75625 | 43.079 |
| 0.7569444444444445 | 38.653 |
| 0.7576388888888889 | 38.653 |
| 0.7583333333333333 | 38.653 |
| 0.7590277777777777 | 38.653 |
| 0.7597222222222223 | 38.653 |
| 0.7604166666666666 | 38.653 |
| 0.7611111111111111 | 38.653 |
| 0.7618055555555556 | 38.653 |
| 0.7625000000000001 | 38.653 |
| 0.7631944444444444 | 38.653 |
| 0.7638888888888888 | 38.653 |
| 0.7645833333333334 | 38.653 |
| 0.7652777777777778 | 38.653 |
| 0.7659722222222222 | 38.653 |
| 0.7666666666666666 | 43.079 |
| 0.7673611111111112 | 43.079 |
| 0.7680555555555556 | 43.079 |
| 0.7687499999999999 | 43.079 |
| 0.7694444444444444 | 47.511 |
| 0.7701388888888889 | 56.398 |
| 0.7708333333333334 | 60.85 |
| 0.7715277777777777 | 60.85 |
| 0.7722222222222223 | 60.85 |
| 0.7729166666666667 | 56.398 |
| 0.7736111111111111 | 56.398 |
| 0.7743055555555555 | 56.398 |
| 0.775 | 56.398 |
| 0.7756944444444445 | 56.398 |
| 0.7763888888888889 | 56.398 |
| 0.7770833333333332 | 56.398 |
| 0.7777777777777778 | 56.398 |
| 0.7784722222222222 | 60.85 |
| 0.7791666666666667 | 65.31 |
| 0.779861111111111 | 65.31 |
| 0.7805555555555556 | 69.775 |
| 0.78125 | 69.775 |
| 0.7819444444444444 | 69.775 |
| 0.782638888888889 | 69.775 |
| 0.7833333333333333 | 69.775 |
| 0.7840277777777778 | 65.31 |
| 0.7847222222222222 | 65.31 |
| 0.7854166666666668 | 60.85 |
| 0.7861111111111111 | 60.85 |
| 0.7868055555555555 | 56.398 |
| 0.7875 | 56.398 |
| 0.7881944444444445 | 51.951 |
| 0.7888888888888889 | 51.951 |
| 0.7895833333333333 | 47.511 |
| 0.7902777777777777 | 47.511 |
| 0.7909722222222223 | 47.511 |
| 0.7916666666666666 | 43.079 |
| 0.7923611111111111 | 43.079 |
| 0.7930555555555556 | 38.653 |
| 0.7937500000000001 | 38.653 |
| 0.7944444444444444 | 38.653 |
| 0.7951388888888888 | 34.234 |
| 0.7958333333333334 | 34.234 |
| 0.7965277777777778 | 34.234 |
| 0.7972222222222222 | 34.234 |
| 0.7979166666666666 | 29.823 |
| 0.7986111111111112 | 29.823 |
| 0.7993055555555556 | 29.823 |
| 0.7999999999999999 | 29.823 |
| 0.8006944444444444 | 29.823 |
| 0.8013888888888889 | 29.823 |
| 0.8020833333333334 | 25.419 |
| 0.8027777777777777 | 25.419 |
| 0.8034722222222223 | 25.419 |
| 0.8041666666666667 | 25.419 |
| 0.8048611111111111 | 25.419 |
| 0.8055555555555555 | 21.024 |
| 0.80625 | 21.024 |
| 0.8069444444444445 | 21.024 |
| 0.8076388888888889 | 21.024 |
| 0.8083333333333332 | 21.024 |
| 0.8090277777777778 | 21.024 |
| 0.8097222222222222 | 16.636 |
| 0.8104166666666667 | 16.636 |
| 0.811111111111111 | 16.636 |
| 0.8118055555555556 | 12.257 |
| 0.8125 | 12.257 |
| 0.8131944444444444 | 12.257 |
| 0.813888888888889 | 12.257 |
| 0.8145833333333333 | 12.257 |
| 0.8152777777777778 | 7.887 |
| 0.8159722222222222 | 7.887 |
| 0.8166666666666668 | 7.887 |
| 0.8173611111111111 | 7.887 |
| 0.8180555555555555 | 7.887 |
| 0.81875 | 7.887 |
| 0.8194444444444445 | 7.887 |
| 0.8201388888888889 | 7.887 |
| 0.8208333333333333 | 7.887 |
| 0.8215277777777777 | 7.887 |
| 0.8222222222222223 | 7.887 |
| 0.8229166666666666 | 3.525 |
| 0.8236111111111111 | 3.525 |
| 0.8243055555555556 | 3.525 |
| 0.8250000000000001 | 3.525 |
| 0.8256944444444444 | 3.525 |
| 0.8263888888888888 | 3.525 |
| 0.8270833333333334 | 3.525 |
| 0.8277777777777778 | 3.525 |
| 0.8284722222222222 | 3.525 |
| 0.8291666666666666 | 3.525 |
| 0.8298611111111112 | 0 |
| 0.8305555555555556 | 0 |
| 0.8312499999999999 | 0 |
| 0.8319444444444444 | 0 |
| 0.8326388888888889 | 0 |
| 0.8333333333333334 | 0 |
| 0.8340277777777777 | 0 |
| 0.8347222222222223 | 0 |
| 0.8354166666666667 | 0 |
| 0.8361111111111111 | 0 |
| 0.8368055555555555 | 0 |
| 0.8375 | 0 |
| 0.8381944444444445 | 0 |
| 0.8388888888888889 | 0 |
| 0.8395833333333332 | 0 |
| 0.8402777777777778 | 0 |
| 0.8409722222222222 | 0 |
| 0.8416666666666667 | 0 |
| 0.842361111111111 | 0 |
| 0.8430555555555556 | 0 |
| 0.84375 | 0 |
| 0.8444444444444444 | 0 |
| 0.845138888888889 | 0 |
| 0.8458333333333333 | 0 |
| 0.8465277777777778 | 0 |
| 0.8472222222222222 | 0 |
| 0.8479166666666668 | 0 |
| 0.8486111111111111 | 0 |
| 0.8493055555555555 | 0 |
| 0.85 | 0 |
| 0.8506944444444445 | 0 |
| 0.8513888888888889 | 0 |
| 0.8520833333333333 | 0 |
| 0.8527777777777777 | 0 |
| 0.8534722222222223 | 0 |
| 0.8541666666666666 | 0 |
| 0.8548611111111111 | 0 |
| 0.8555555555555556 | 0 |
| 0.8562500000000001 | 0 |
| 0.8569444444444444 | 0 |
| 0.8576388888888888 | 0 |
| 0.8583333333333334 | 0 |
| 0.8590277777777778 | 0 |
| 0.8597222222222222 | 0 |
| 0.8604166666666666 | 0 |
| 0.8611111111111112 | 0 |
| 0.8618055555555556 | 0 |
| 0.8624999999999999 | 0 |
| 0.8631944444444444 | 0 |
| 0.8638888888888889 | 0 |
| 0.8645833333333334 | 0 |
| 0.8652777777777777 | 0 |
| 0.8659722222222223 | 0 |
| 0.8666666666666667 | 0 |
| 0.8673611111111111 | 0 |
| 0.8680555555555555 | 0 |
| 0.86875 | 0 |
| 0.8694444444444445 | 0 |
| 0.8701388888888889 | 0 |
| 0.8708333333333332 | 0 |
| 0.8715277777777778 | 0 |
| 0.8722222222222222 | 0 |
| 0.8729166666666667 | 0 |
| 0.873611111111111 | 0 |
| 0.8743055555555556 | 0 |
| 0.875 | 0 |
| 0.8756944444444444 | 0 |
| 0.876388888888889 | 0 |
| 0.8770833333333333 | 0 |
| 0.8777777777777778 | 0 |
| 0.8784722222222222 | 0 |
| 0.8791666666666668 | 0 |
| 0.8798611111111111 | 0 |
| 0.8805555555555555 | 0 |
| 0.88125 | 0 |
| 0.8819444444444445 | 0 |
| 0.8826388888888889 | 0 |
| 0.8833333333333333 | 0 |
| 0.8840277777777777 | 0 |
| 0.8847222222222223 | 0 |
| 0.8854166666666666 | 0 |
| 0.8861111111111111 | 0 |
| 0.8868055555555556 | 0 |
| 0.8875000000000001 | 0 |
| 0.8881944444444444 | 0 |
| 0.8888888888888888 | 0 |
| 0.8895833333333334 | 0 |
| 0.8902777777777778 | 0 |
| 0.8909722222222222 | 0 |
| 0.8916666666666666 | 0 |
| 0.8923611111111112 | 0 |
| 0.8930555555555556 | 0 |
| 0.8937499999999999 | 0 |
| 0.8944444444444444 | 0 |
| 0.8951388888888889 | 0 |
| 0.8958333333333334 | 0 |
| 0.8965277777777777 | 0 |
| 0.8972222222222223 | 0 |
| 0.8979166666666667 | 0 |
| 0.8986111111111111 | 0 |
| 0.8993055555555555 | 0 |
| 0.9 | 0 |
| 0.9006944444444445 | 0 |
| 0.9013888888888889 | 0 |
| 0.9020833333333332 | 0 |
| 0.9027777777777778 | 0 |
| 0.9034722222222222 | 0 |
| 0.9041666666666667 | 0 |
| 0.904861111111111 | 0 |
| 0.9055555555555556 | 0 |
| 0.90625 | 0 |
| 0.9069444444444444 | 0 |
| 0.907638888888889 | 0 |
| 0.9083333333333333 | 0 |
| 0.9090277777777778 | 0 |
| 0.9097222222222222 | 0 |
| 0.9104166666666668 | 0 |
| 0.9111111111111111 | 0 |
| 0.9118055555555555 | 0 |
| 0.9125 | 0 |
| 0.9131944444444445 | 0 |
| 0.9138888888888889 | 0 |
| 0.9145833333333333 | 0 |
| 0.9152777777777777 | 0 |
| 0.9159722222222223 | 0 |
| 0.9166666666666666 | 0 |
| 0.9173611111111111 | 0 |
| 0.9180555555555556 | 0 |
| 0.9187500000000001 | 0 |
| 0.9194444444444444 | 0 |
| 0.9201388888888888 | 0 |
| 0.9208333333333334 | 0 |
| 0.9215277777777778 | 0 |
| 0.9222222222222222 | 0 |
| 0.9229166666666666 | 0 |
| 0.9236111111111112 | 0 |
| 0.9243055555555556 | 0 |
| 0.9249999999999999 | 0 |
| 0.9256944444444444 | 0 |
| 0.9263888888888889 | 0 |
| 0.9270833333333334 | 0 |
| 0.9277777777777777 | 0 |
| 0.9284722222222223 | 0 |
| 0.9291666666666667 | 0 |
| 0.9298611111111111 | 0 |
| 0.9305555555555555 | 0 |
| 0.93125 | 0 |
| 0.9319444444444445 | 0 |
| 0.9326388888888889 | 0 |
| 0.9333333333333332 | 0 |
| 0.9340277777777778 | 0 |
| 0.9347222222222222 | 0 |
| 0.9354166666666667 | 0 |
| 0.936111111111111 | 0 |
| 0.9368055555555556 | 0 |
| 0.9375 | 0 |
| 0.9381944444444444 | 0 |
| 0.938888888888889 | 0 |
| 0.9395833333333333 | 0 |
| 0.9402777777777778 | 0 |
| 0.9409722222222222 | 0 |
| 0.9416666666666668 | 0 |
| 0.9423611111111111 | 0 |
| 0.9430555555555555 | 0 |
| 0.94375 | 0 |
| 0.9444444444444445 | 0 |
| 0.9451388888888889 | 0 |
| 0.9458333333333333 | 0 |
| 0.9465277777777777 | 0 |
| 0.9472222222222223 | 0 |
| 0.9479166666666666 | 0 |
| 0.9486111111111111 | 0 |
| 0.9493055555555556 | 0 |
| 0.9500000000000001 | 0 |
| 0.9506944444444444 | 0 |
| 0.9513888888888888 | 0 |
| 0.9520833333333334 | 0 |
| 0.9527777777777778 | 0 |
| 0.9534722222222222 | 0 |
| 0.9541666666666666 | 0 |
| 0.9548611111111112 | 0 |
| 0.9555555555555556 | 0 |
| 0.9562499999999999 | 0 |
| 0.9569444444444444 | 0 |
| 0.9576388888888889 | 0 |
| 0.9583333333333334 | 0 |
| 0.9590277777777777 | 0 |
| 0.9597222222222223 | 0 |
| 0.9604166666666667 | 0 |
| 0.9611111111111111 | 0 |
| 0.9618055555555555 | 0 |
| 0.9625 | 0 |
| 0.9631944444444445 | 0 |
| 0.9638888888888889 | 0 |
| 0.9645833333333332 | 0 |
| 0.9652777777777778 | 0 |
| 0.9659722222222222 | 0 |
| 0.9666666666666667 | 0 |
| 0.967361111111111 | 0 |
| 0.9680555555555556 | 0 |
| 0.96875 | 0 |
| 0.9694444444444444 | 0 |
| 0.970138888888889 | 0 |
| 0.9708333333333333 | 0 |
| 0.9715277777777778 | 0 |
| 0.9722222222222222 | 0 |
| 0.9729166666666668 | 0 |
| 0.9736111111111111 | 0 |
| 0.9743055555555555 | 0 |
| 0.975 | 0 |
| 0.9756944444444445 | 0 |
| 0.9763888888888889 | 0 |
| 0.9770833333333333 | 0 |
| 0.9777777777777777 | 0 |
| 0.9784722222222223 | 0 |
| 0.9791666666666666 | 0 |
| 0.9798611111111111 | 0 |
| 0.9805555555555556 | 0 |
| 0.9812500000000001 | 0 |
| 0.9819444444444444 | 0 |
| 0.9826388888888888 | 0 |
| 0.9833333333333334 | 0 |
| 0.9840277777777778 | 0 |
| 0.9847222222222222 | 0 |
| 0.9854166666666666 | 0 |
| 0.9861111111111112 | 0 |
| 0.9868055555555556 | 0 |
| 0.9874999999999999 | 0 |
| 0.9881944444444444 | 0 |
| 0.9888888888888889 | 0 |
| 0.9895833333333334 | 0 |
| 0.9902777777777777 | 0 |
| 0.9909722222222223 | 0 |
| 0.9916666666666667 | 0 |
| 0.9923611111111111 | 0 |
| 0.9930555555555555 | 0 |
| 0.99375 | 0 |
| 0.9944444444444445 | 0 |
| 0.9951388888888889 | 0 |
| 0.9958333333333332 | 0 |
| 0.9965277777777778 | 0 |
| 0.9972222222222222 | 0 |
| 0.9979166666666667 | 0 |
| 0.998611111111111 | 0 |
| 0.9993055555555556 | 0 |